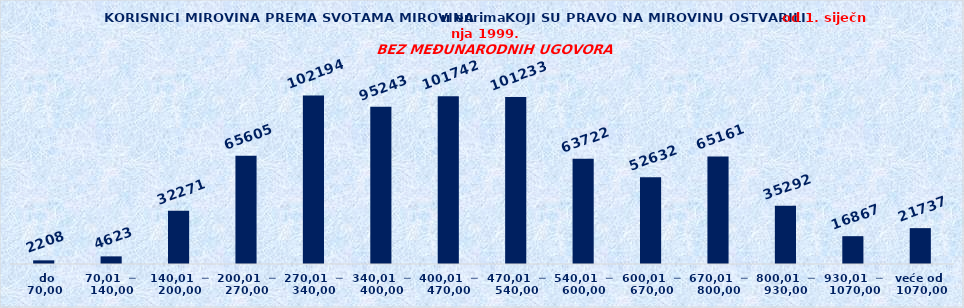
| Category | Series 0 |
|---|---|
|   do  70,00 | 2208 |
| 70,01  ─  140,00 | 4623 |
| 140,01  ─  200,00 | 32271 |
| 200,01  ─  270,00 | 65605 |
| 270,01  ─  340,00 | 102194 |
| 340,01  ─  400,00 | 95243 |
| 400,01  ─  470,00 | 101742 |
| 470,01  ─  540,00 | 101233 |
| 540,01  ─  600,00 | 63722 |
| 600,01  ─  670,00 | 52632 |
| 670,01  ─  800,00 | 65161 |
| 800,01  ─  930,00 | 35292 |
| 930,01  ─  1070,00 | 16867 |
| veće od  1070,00 | 21737 |